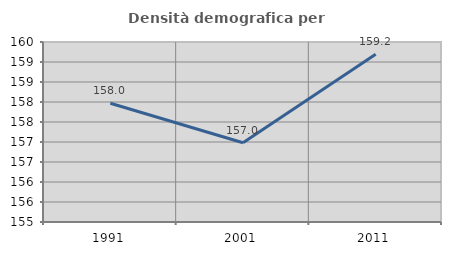
| Category | Densità demografica |
|---|---|
| 1991.0 | 157.969 |
| 2001.0 | 156.982 |
| 2011.0 | 159.196 |